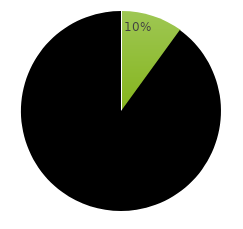
| Category | Series 0 |
|---|---|
| 0 | 0.1 |
| 1 | 0.9 |